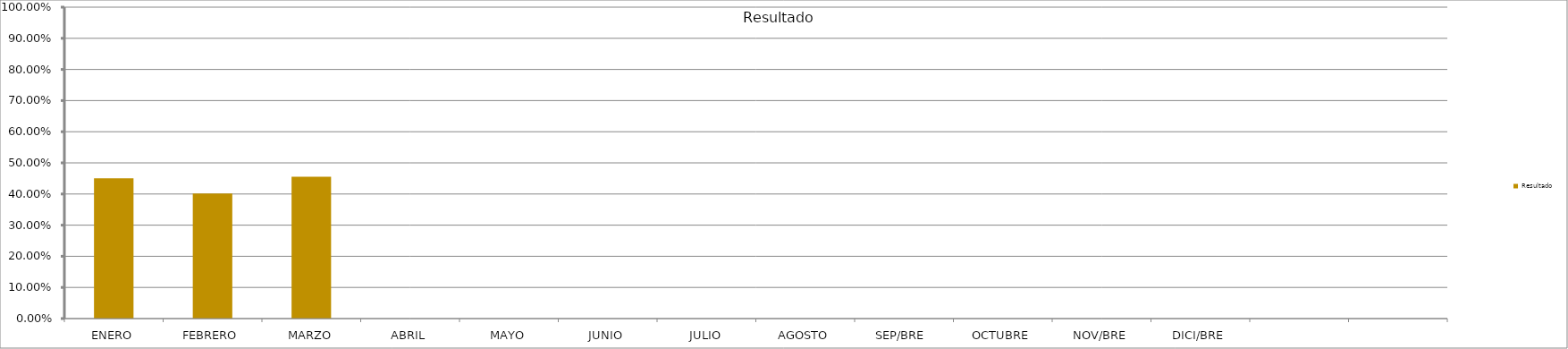
| Category | Resultado  |
|---|---|
| ENERO | 0.45 |
| FEBRERO | 0.401 |
| MARZO | 0.455 |
| ABRIL | 0 |
| MAYO | 0 |
| JUNIO | 0 |
| JULIO | 0 |
| AGOSTO | 0 |
| SEP/BRE  | 0 |
| OCTUBRE | 0 |
| NOV/BRE | 0 |
| DICI/BRE | 0 |